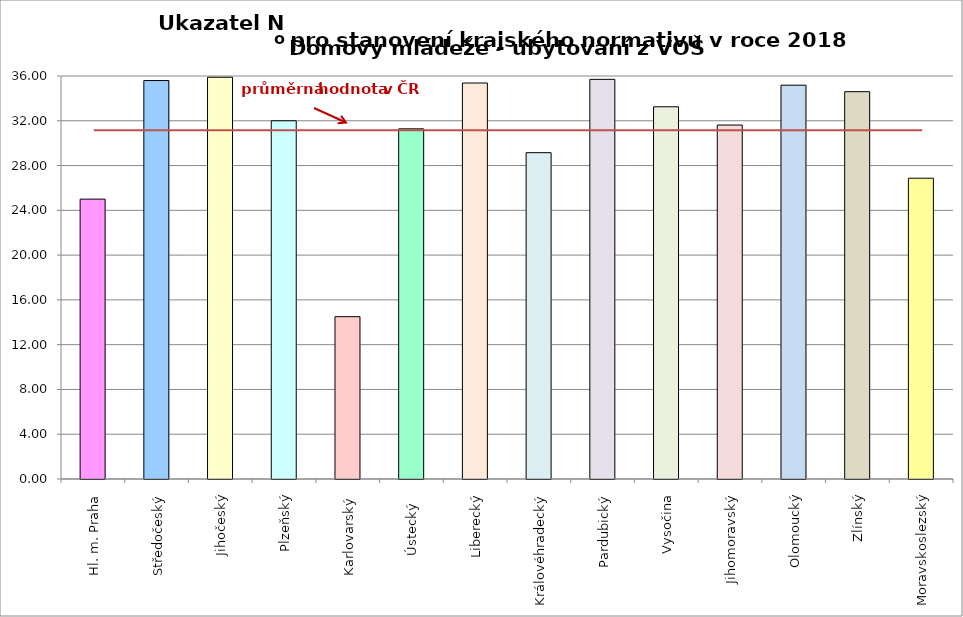
| Category | Series 0 |
|---|---|
| Hl. m. Praha | 25 |
| Středočeský | 35.595 |
| Jihočeský | 35.887 |
| Plzeňský | 32 |
| Karlovarský  | 14.5 |
| Ústecký   | 31.28 |
| Liberecký | 35.374 |
| Královéhradecký | 29.15 |
| Pardubický | 35.7 |
| Vysočina | 33.25 |
| Jihomoravský | 31.62 |
| Olomoucký | 35.18 |
| Zlínský | 34.6 |
| Moravskoslezský | 26.87 |